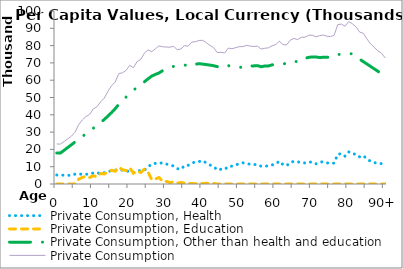
| Category | Private Consumption, Health | Private Consumption, Education | Private Consumption, Other than health and education | Private Consumption |
|---|---|---|---|---|
| 0 | 5221.085 | 0 | 17905.087 | 23126.172 |
|  | 5156.137 | 0 | 17905.087 | 23061.224 |
| 2 | 5091.19 | 0 | 19498.283 | 24589.473 |
| 3 | 5026.242 | 0 | 21091.48 | 26117.722 |
| 4 | 4976.944 | 0 | 22684.677 | 27661.621 |
| 5 | 5723.005 | 0 | 24277.873 | 30000.878 |
| 6 | 5631.005 | 2811.205 | 25871.07 | 34313.28 |
| 7 | 5772.965 | 3811.424 | 27464.267 | 37048.656 |
| 8 | 5605.561 | 4394.81 | 29057.463 | 39057.834 |
| 9 | 5790.145 | 3771.09 | 30650.66 | 40211.894 |
| 10 | 6368 | 4779.854 | 32243.857 | 43391.711 |
| 11 | 6632.156 | 4189.94 | 33856.728 | 44678.824 |
| 12 | 5735.567 | 6096.517 | 35635.278 | 47467.363 |
| 13 | 6543.27 | 5839.135 | 37261.893 | 49644.297 |
| 14 | 7275.096 | 6989.387 | 39268.428 | 53532.912 |
| 15 | 7581.21 | 7952.46 | 41271.131 | 56804.801 |
| 16 | 8064.212 | 7354.535 | 43494.361 | 58913.108 |
| 17 | 8032.741 | 9660.101 | 46127.487 | 63820.329 |
| 18 | 8057.262 | 8226.667 | 47998.552 | 64282.481 |
| 19 | 7672.091 | 7754.282 | 50293.008 | 65719.381 |
| 20 | 7084.638 | 9338.114 | 52187.294 | 68610.047 |
| 21 | 6725.737 | 6234.421 | 54242.483 | 67202.642 |
| 22 | 7344.218 | 7597.169 | 55846.039 | 70787.426 |
| 23 | 7908.787 | 6643.675 | 57421.852 | 71974.314 |
| 24 | 8009.921 | 8537.661 | 59086.018 | 75633.6 |
| 25 | 9793.671 | 6949.389 | 60786.449 | 77529.508 |
| 26 | 11562.505 | 2509.255 | 62357.344 | 76429.104 |
| 27 | 11916.06 | 2881.478 | 63339.365 | 78136.904 |
| 28 | 11888.202 | 3758.859 | 64172.721 | 79819.781 |
| 29 | 12321.349 | 1483.263 | 65528.482 | 79333.094 |
| 30 | 11575.932 | 1500.406 | 66072.451 | 79148.789 |
| 31 | 11045.682 | 885.722 | 67152.102 | 79083.506 |
| 32 | 10379.186 | 1204.932 | 67976.073 | 79560.191 |
| 33 | 8881.911 | 498.855 | 68270.799 | 77651.564 |
| 34 | 8503.587 | 879.764 | 68652.138 | 78035.488 |
| 35 | 10633.87 | 585.238 | 68746.316 | 79965.424 |
| 36 | 10811.778 | 371.89 | 68507.473 | 79691.142 |
| 37 | 12072.933 | 228.405 | 69735.473 | 82036.811 |
| 38 | 12776.949 | 196.938 | 69267.477 | 82241.365 |
| 39 | 13021.359 | 421.042 | 69548.732 | 82991.133 |
| 40 | 13491.187 | 268.494 | 69296.381 | 83056.061 |
| 41 | 12132.043 | 451.916 | 69010.904 | 81594.863 |
| 42 | 10974.4 | 395.828 | 68727.935 | 80098.163 |
| 43 | 10083.47 | 298.96 | 68357.457 | 78739.887 |
| 44 | 8068.17 | 0 | 67834.941 | 75903.111 |
| 45 | 8531.835 | 0 | 67583.132 | 76114.966 |
| 46 | 8412.36 | 0 | 67307.266 | 75719.626 |
| 47 | 10165.552 | 0 | 68416.425 | 78581.977 |
| 48 | 10298.471 | 0 | 67866.505 | 78164.976 |
| 49 | 11005.031 | 0 | 67792.62 | 78797.651 |
| 50 | 11723.888 | 0 | 67639.546 | 79363.433 |
| 51 | 12234.821 | 0 | 67207.237 | 79442.058 |
| 52 | 11713.704 | 0 | 68455.319 | 80169.023 |
| 53 | 11487.535 | 0 | 68238.507 | 79726.042 |
| 54 | 11202.158 | 0 | 68276.308 | 79478.466 |
| 55 | 11280.9 | 0 | 68423.559 | 79704.459 |
| 56 | 10214.097 | 0 | 67787.683 | 78001.78 |
| 57 | 10226.602 | 0 | 68206.275 | 78432.877 |
| 58 | 10522.513 | 0 | 68202.775 | 78725.288 |
| 59 | 11000.806 | 0 | 68888.114 | 79888.92 |
| 60 | 11662.066 | 0 | 68927.071 | 80589.137 |
| 61 | 13194.547 | 0 | 69353.825 | 82548.371 |
| 62 | 11199.951 | 0 | 69353.116 | 80553.067 |
| 63 | 10594.199 | 0 | 69860.647 | 80454.846 |
| 64 | 12476.554 | 0 | 70685.526 | 83162.08 |
| 65 | 13115.411 | 0 | 71023.363 | 84138.775 |
| 66 | 12826.279 | 0 | 70621.669 | 83447.948 |
| 67 | 12369.634 | 0 | 72444.28 | 84813.914 |
| 68 | 12169.7 | 0 | 72671.528 | 84841.228 |
| 69 | 12764.757 | 0 | 73155.35 | 85920.107 |
| 70 | 12569.145 | 0 | 73474.708 | 86043.853 |
| 71 | 11631.249 | 0 | 73449.112 | 85080.361 |
| 72 | 12623.83 | 0 | 73082.008 | 85705.839 |
| 73 | 12881.853 | 0 | 73241.805 | 86123.657 |
| 74 | 12197.003 | 0 | 73228.657 | 85425.66 |
| 75 | 11985.606 | 0 | 73222.738 | 85208.343 |
| 76 | 12059.579 | 0 | 73876.177 | 85935.756 |
| 77 | 17167.206 | 0 | 74929.702 | 92096.908 |
| 78 | 17542.8 | 0 | 74892.154 | 92434.954 |
| 79 | 16063.253 | 0 | 75126.55 | 91189.803 |
| 80 | 18587.606 | 0 | 75280.828 | 93868.434 |
| 81 | 17376.975 | 0 | 75276.521 | 92653.496 |
| 82 | 17261.578 | 0 | 73537.424 | 90799.002 |
| 83 | 15672.769 | 0 | 72143.357 | 87816.127 |
| 84 | 16382.372 | 0 | 70749.291 | 87131.663 |
| 85 | 14488.342 | 0 | 69355.225 | 83843.567 |
| 86 | 13099.16 | 0 | 67961.159 | 81060.319 |
| 87 | 12445.16 | 0 | 66567.092 | 79012.252 |
| 88 | 11791.16 | 0 | 65173.026 | 76964.186 |
| 89 | 11791.16 | 0 | 63778.96 | 75570.12 |
| 90+ | 10483.16 | 0 | 62384.893 | 72868.054 |